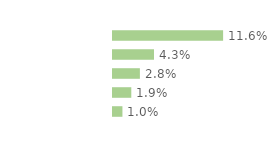
| Category | Series 0 |
|---|---|
| 18-29 ans | 0.116 |
| 30-39 ans | 0.043 |
| 40-49 ans | 0.028 |
| 50-59 ans | 0.019 |
| 60-75 ans | 0.01 |